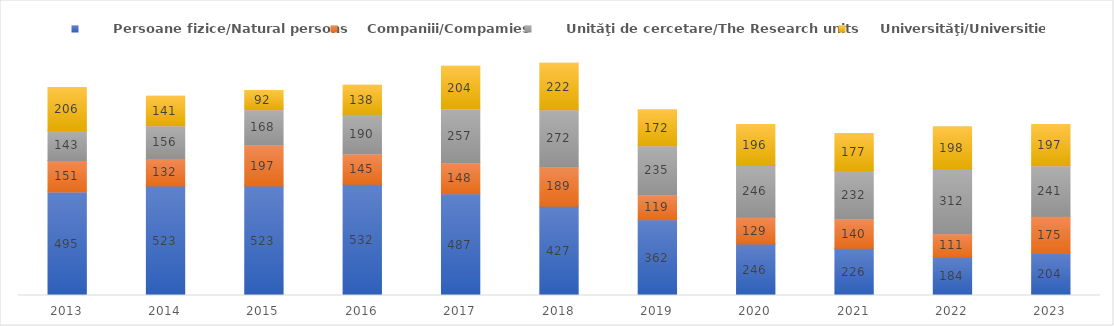
| Category |       Persoane fizice/Natural persons |      Companiii/Compamies |       Unităţi de cercetare/The Research units |       Universităţi/Universities |
|---|---|---|---|---|
| 2013.0 | 495 | 151 | 143 | 206 |
| 2014.0 | 523 | 132 | 156 | 141 |
| 2015.0 | 523 | 197 | 168 | 92 |
| 2016.0 | 532 | 145 | 190 | 138 |
| 2017.0 | 487 | 148 | 257 | 204 |
| 2018.0 | 427 | 189 | 272 | 222 |
| 2019.0 | 362 | 119 | 235 | 172 |
| 2020.0 | 246 | 129 | 246 | 196 |
| 2021.0 | 226 | 140 | 232 | 177 |
| 2022.0 | 184 | 111 | 312 | 198 |
| 2023.0 | 204 | 175 | 241 | 197 |